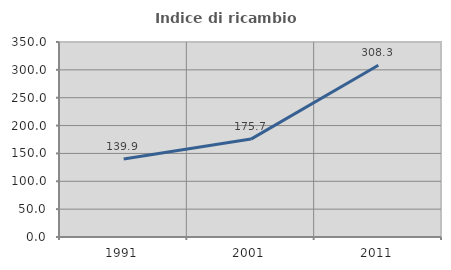
| Category | Indice di ricambio occupazionale  |
|---|---|
| 1991.0 | 139.896 |
| 2001.0 | 175.74 |
| 2011.0 | 308.333 |